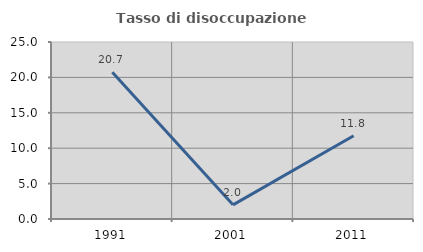
| Category | Tasso di disoccupazione giovanile  |
|---|---|
| 1991.0 | 20.721 |
| 2001.0 | 2 |
| 2011.0 | 11.765 |